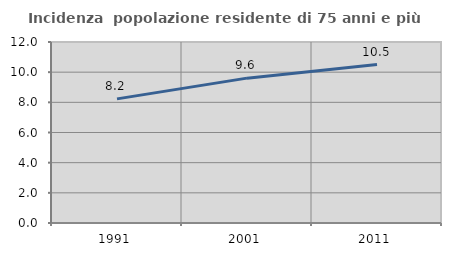
| Category | Incidenza  popolazione residente di 75 anni e più |
|---|---|
| 1991.0 | 8.23 |
| 2001.0 | 9.604 |
| 2011.0 | 10.505 |